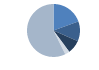
| Category | Series 0 |
|---|---|
| ARRASTRE | 261 |
| CERCO | 163 |
| PALANGRE | 111 |
| REDES DE ENMALLE | 38 |
| ARTES MENORES | 769 |
| SIN TIPO ASIGNADO | 0 |